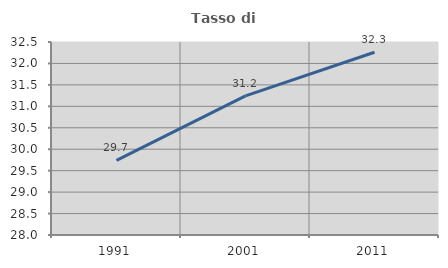
| Category | Tasso di occupazione   |
|---|---|
| 1991.0 | 29.741 |
| 2001.0 | 31.245 |
| 2011.0 | 32.26 |